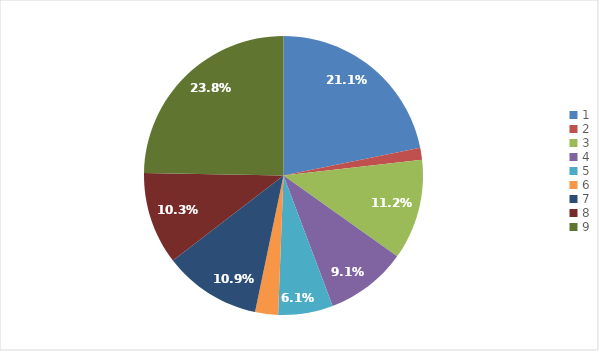
| Category | Series 0 |
|---|---|
| 0 | 0.211 |
| 1 | 0.013 |
| 2 | 0.112 |
| 3 | 0.091 |
| 4 | 0.061 |
| 5 | 0.026 |
| 6 | 0.109 |
| 7 | 0.103 |
| 8 | 0.238 |